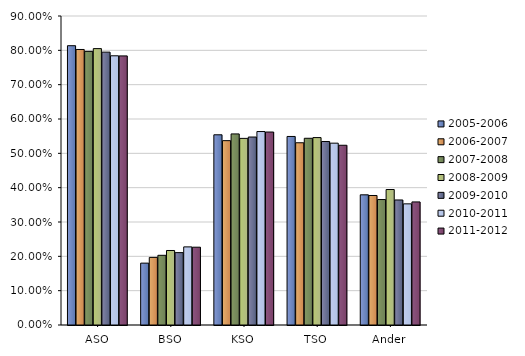
| Category | 2005-2006 | 2006-2007 | 2007-2008 | 2008-2009 | 2009-2010 | 2010-2011 | 2011-2012 |
|---|---|---|---|---|---|---|---|
| ASO | 0.813 | 0.803 | 0.797 | 0.805 | 0.795 | 0.784 | 0.784 |
| BSO | 0.18 | 0.197 | 0.203 | 0.217 | 0.211 | 0.228 | 0.227 |
| KSO | 0.554 | 0.537 | 0.557 | 0.544 | 0.548 | 0.563 | 0.562 |
| TSO | 0.549 | 0.531 | 0.544 | 0.546 | 0.534 | 0.53 | 0.524 |
| Ander | 0.379 | 0.377 | 0.365 | 0.395 | 0.364 | 0.353 | 0.359 |